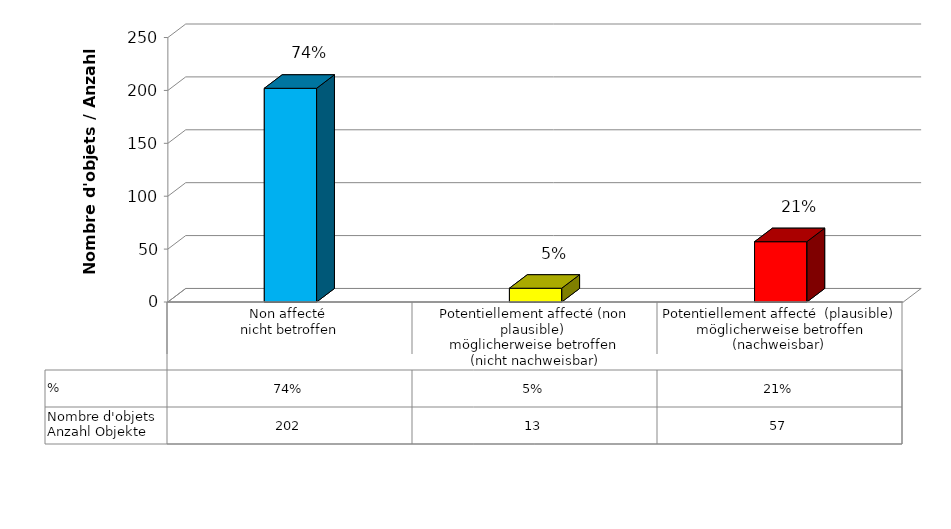
| Category | Nombre d'objets
Anzahl Objekte | % |
|---|---|---|
| Non affecté 
nicht betroffen | 202 | 0.743 |
| Potentiellement affecté (non plausible) 
möglicherweise betroffen
 (nicht nachweisbar) | 13 | 0.048 |
| Potentiellement affecté  (plausible)
 möglicherweise betroffen (nachweisbar) | 57 | 0.21 |